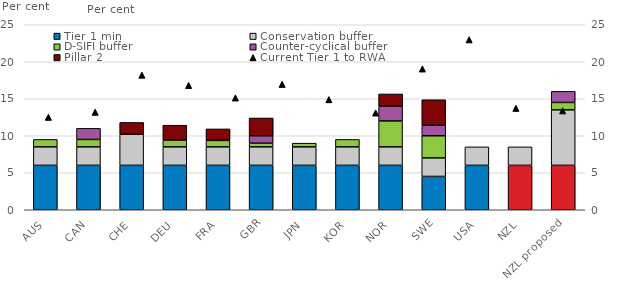
| Category | Tier 1 min | Conservation buffer | D-SIFI buffer | Counter-cyclical buffer | Pillar 2 |
|---|---|---|---|---|---|
| AUS | 6 | 2.5 | 1 | 0 | 0 |
| CAN | 6 | 2.5 | 1 | 1.5 | 0 |
| CHE | 6 | 4.2 | 0 | 0 | 1.6 |
| DEU | 6 | 2.5 | 0.923 | 0 | 2 |
| FRA | 6 | 2.5 | 0.875 | 0 | 1.55 |
| GBR | 6 | 2.5 | 0.5 | 1 | 2.4 |
| JPN | 6 | 2.5 | 0.5 | 0 | 0 |
| KOR | 6 | 2.5 | 1 | 0 | 0 |
| NOR | 6 | 2.5 | 3.5 | 2 | 1.65 |
| SWE | 4.5 | 2.5 | 3 | 1.433 | 3.433 |
| USA | 6 | 2.5 | 0 | 0 | 0 |
| NZL | 6 | 2.5 | 0 | 0 | 0 |
| NZL proposed | 6 | 7.5 | 1 | 1.5 | 0 |